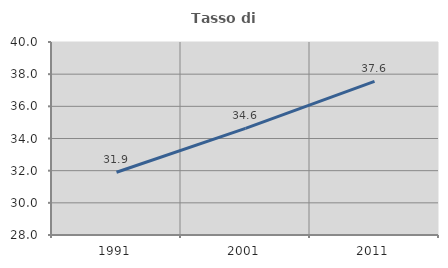
| Category | Tasso di occupazione   |
|---|---|
| 1991.0 | 31.904 |
| 2001.0 | 34.634 |
| 2011.0 | 37.556 |